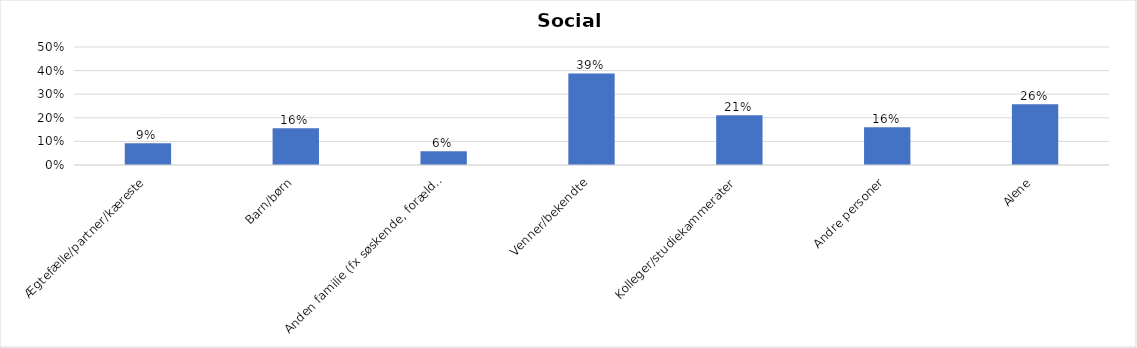
| Category | % |
|---|---|
| Ægtefælle/partner/kæreste | 0.093 |
| Barn/børn | 0.155 |
| Anden familie (fx søskende, forældre) | 0.058 |
| Venner/bekendte | 0.388 |
| Kolleger/studiekammerater | 0.21 |
| Andre personer | 0.16 |
| Alene | 0.257 |